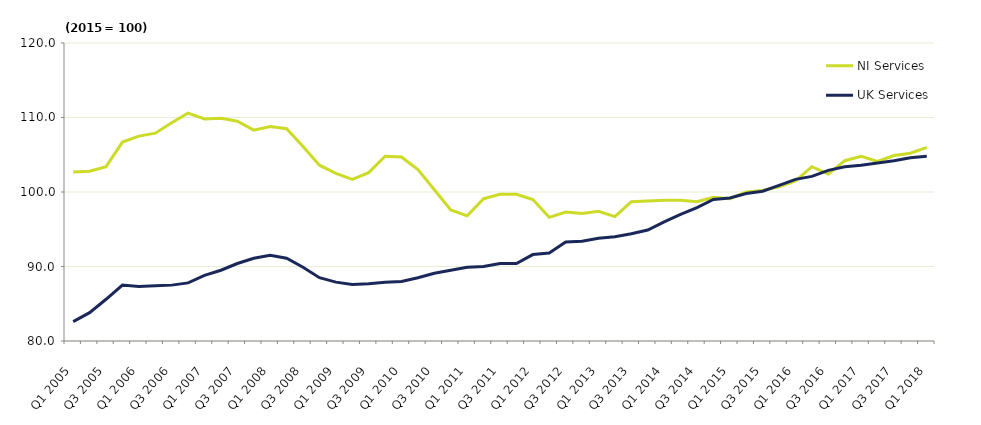
| Category | NI Services | UK Services |
|---|---|---|
| Q1 2005 | 102.7 | 82.6 |
| Q2 2005 | 102.8 | 83.8 |
| Q3 2005 | 103.4 | 85.6 |
| Q4 2005 | 106.7 | 87.5 |
| Q1 2006 | 107.5 | 87.3 |
| Q2 2006 | 107.9 | 87.4 |
| Q3 2006 | 109.3 | 87.5 |
| Q4 2006 | 110.6 | 87.8 |
| Q1 2007 | 109.8 | 88.8 |
| Q2 2007 | 109.9 | 89.5 |
| Q3 2007 | 109.5 | 90.4 |
| Q4 2007 | 108.3 | 91.1 |
| Q1 2008 | 108.8 | 91.5 |
| Q2 2008 | 108.5 | 91.1 |
| Q3 2008 | 106.1 | 89.9 |
| Q4 2008 | 103.6 | 88.5 |
| Q1 2009 | 102.5 | 87.9 |
| Q2 2009 | 101.7 | 87.6 |
| Q3 2009 | 102.6 | 87.7 |
| Q4 2009 | 104.8 | 87.9 |
| Q1 2010 | 104.7 | 88 |
| Q2 2010 | 103 | 88.5 |
| Q3 2010 | 100.3 | 89.1 |
| Q4 2010 | 97.6 | 89.5 |
| Q1 2011 | 96.8 | 89.9 |
| Q2 2011 | 99.1 | 90 |
| Q3 2011 | 99.7 | 90.4 |
| Q4 2011 | 99.7 | 90.4 |
| Q1 2012 | 99 | 91.6 |
| Q2 2012 | 96.6 | 91.8 |
| Q3 2012 | 97.3 | 93.3 |
| Q4 2012 | 97.1 | 93.4 |
| Q1 2013 | 97.4 | 93.8 |
| Q2 2013 | 96.7 | 94 |
| Q3 2013 | 98.7 | 94.4 |
| Q4 2013 | 98.8 | 94.9 |
| Q1 2014 | 98.9 | 96 |
| Q2 2014 | 98.9 | 97 |
| Q3 2014 | 98.7 | 97.9 |
| Q4 2014 | 99.3 | 99 |
| Q1 2015 | 99.1 | 99.2 |
| Q2 2015 | 100 | 99.8 |
| Q3 2015 | 100.2 | 100.1 |
| Q4 2015 | 100.7 | 100.9 |
| Q1 2016 | 101.5 | 101.7 |
| Q2 2016 | 103.4 | 102.1 |
| Q3 2016 | 102.4 | 102.9 |
| Q4 2016 | 104.2 | 103.4 |
| Q1 2017 | 104.8 | 103.6 |
| Q2 2017 | 104.1 | 103.9 |
| Q3 2017 | 104.9 | 104.2 |
| Q4 2017 | 105.2 | 104.6 |
| Q1 2018 | 106 | 104.8 |